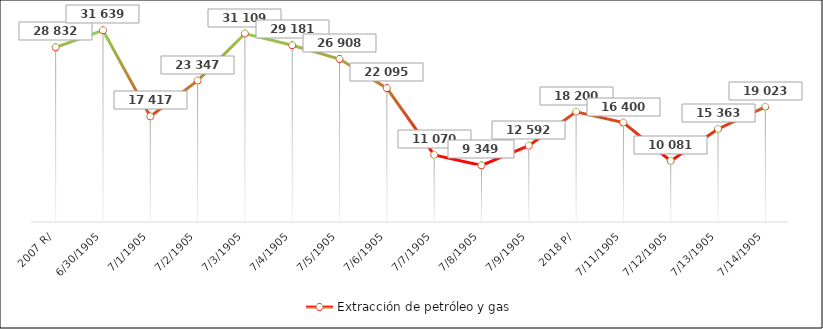
| Category | Extracción de petróleo y gas |
|---|---|
| 2007 R/ | 28832254 |
| 2008 | 31639326 |
| 2009 | 17417546 |
| 2010 | 23347034 |
| 2011 | 31109774 |
| 2012 | 29181614 |
| 2013 | 26908343 |
| 2014 | 22095857 |
| 2015 | 11070631 |
| 2016 | 9349376 |
| 2017 | 12592328 |
| 2018 P/ | 18200713 |
| 2019 | 16400448 |
| 2020 | 10081187 |
| 2021 | 15363195 |
| 2022 | 19023354 |